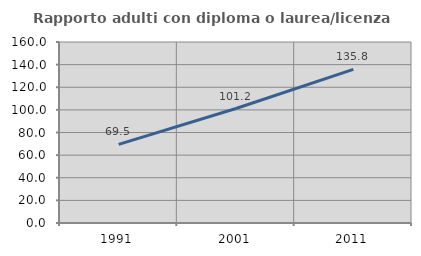
| Category | Rapporto adulti con diploma o laurea/licenza media  |
|---|---|
| 1991.0 | 69.457 |
| 2001.0 | 101.199 |
| 2011.0 | 135.756 |